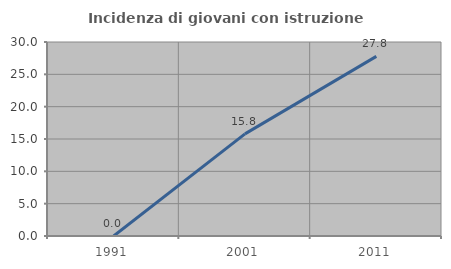
| Category | Incidenza di giovani con istruzione universitaria |
|---|---|
| 1991.0 | 0 |
| 2001.0 | 15.789 |
| 2011.0 | 27.778 |